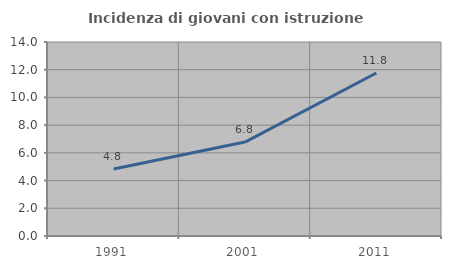
| Category | Incidenza di giovani con istruzione universitaria |
|---|---|
| 1991.0 | 4.839 |
| 2001.0 | 6.78 |
| 2011.0 | 11.765 |